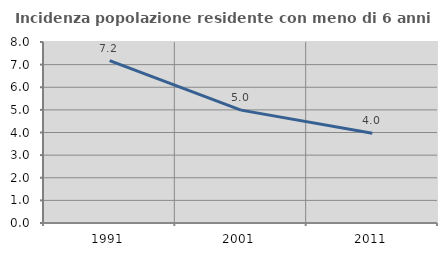
| Category | Incidenza popolazione residente con meno di 6 anni |
|---|---|
| 1991.0 | 7.179 |
| 2001.0 | 4.989 |
| 2011.0 | 3.965 |